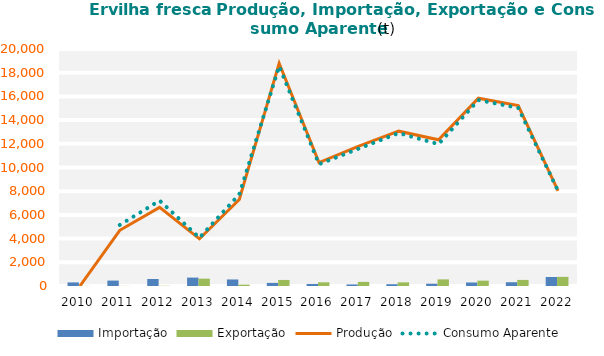
| Category | Importação | Exportação |
|---|---|---|
| 0 | 302.456 | 8.859 |
| 1 | 457.17 | 7.59 |
| 2 | 592.478 | 19.15 |
| 3 | 708.732 | 619.846 |
| 4 | 550.878 | 118.037 |
| 5 | 262.491 | 510.709 |
| 6 | 171.946 | 312.051 |
| 7 | 132.047 | 347.581 |
| 8 | 151.582 | 307.965 |
| 9 | 192.507 | 557.597 |
| 10 | 295.659 | 450.527 |
| 11 | 318.107 | 512.332 |
| 12 | 758.175 | 770.628 |